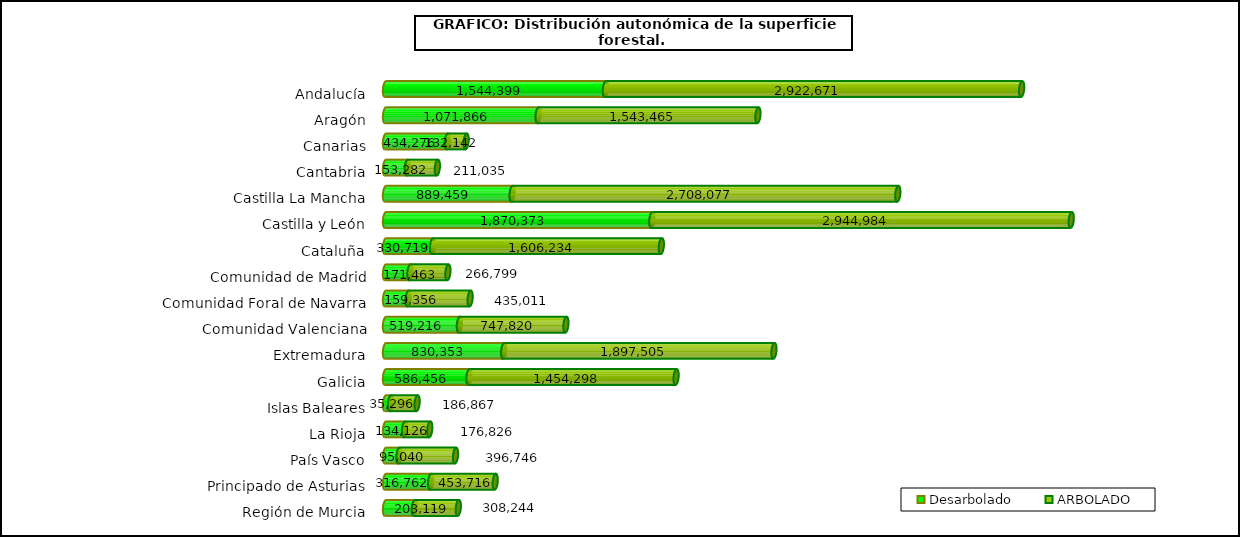
| Category | Desarbolado | ARBOLADO |
|---|---|---|
| Andalucía | 1544399.44 | 2922670.68 |
| Aragón | 1071866.45 | 1543465.17 |
| Canarias | 434275.86 | 132141.95 |
| Cantabria | 153282.49 | 211034.5 |
| Castilla La Mancha | 889459.28 | 2708077.48 |
| Castilla y León | 1870372.83 | 2944983.94 |
| Cataluña | 330718.85 | 1606234.11 |
| Comunidad de Madrid | 171462.57 | 266799.48 |
| Comunidad Foral de Navarra | 159356.48 | 435011.05 |
| Comunidad Valenciana | 519215.63 | 747820.47 |
| Extremadura | 830353.03 | 1897505.2 |
| Galicia | 586456.28 | 1454297.76 |
| Islas Baleares | 35296.27 | 186866.98 |
| La Rioja | 134126.25 | 176826.02 |
| País Vasco | 95040.21 | 396745.85 |
| Principado de Asturias | 316762.43 | 453716.34 |
| Región de Murcia | 203119.38 | 308244.33 |